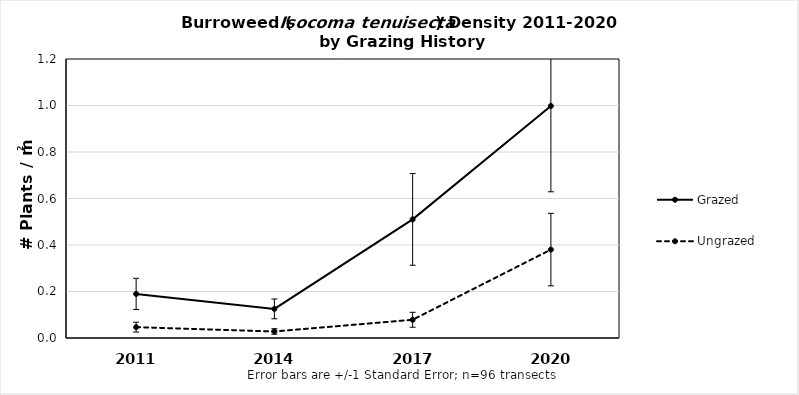
| Category | Grazed | Ungrazed |
|---|---|---|
| 2011.0 | 0.19 | 0.047 |
| 2014.0 | 0.125 | 0.028 |
| 2017.0 | 0.51 | 0.078 |
| 2020.0 | 0.998 | 0.38 |